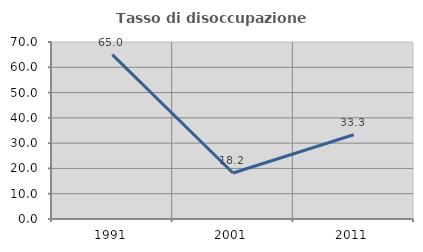
| Category | Tasso di disoccupazione giovanile  |
|---|---|
| 1991.0 | 65 |
| 2001.0 | 18.182 |
| 2011.0 | 33.333 |